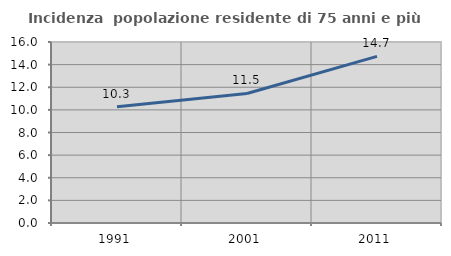
| Category | Incidenza  popolazione residente di 75 anni e più |
|---|---|
| 1991.0 | 10.273 |
| 2001.0 | 11.45 |
| 2011.0 | 14.725 |